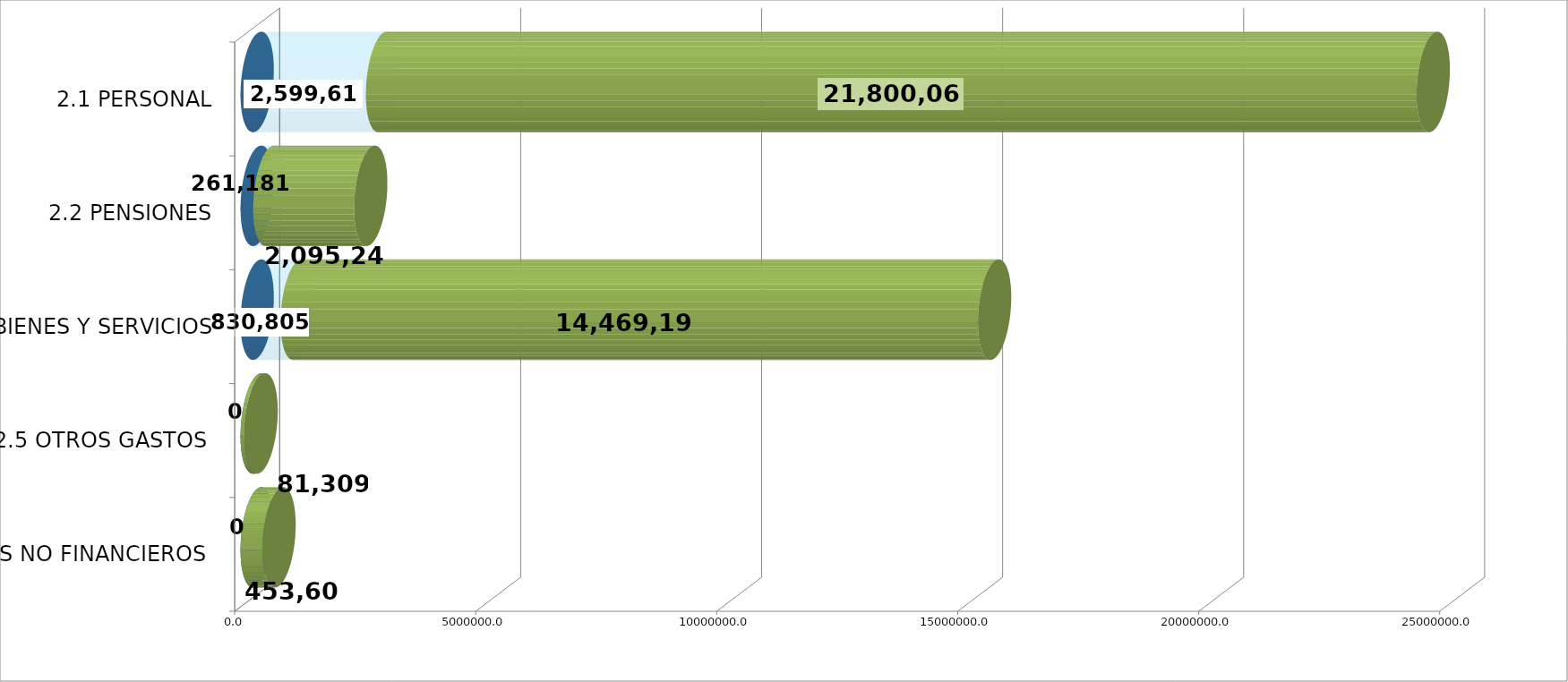
| Category | GENERICA | EJECUTADO | SALDO  |
|---|---|---|---|
| 2.1 PERSONAL | 0 | 2599616.3 | 21800065.7 |
| 2.2 PENSIONES | 0 | 261180.72 | 2095241.28 |
| 2.3 BIENES Y SERVICIOS | 0 | 830805.27 | 14469194.73 |
| 2.5 OTROS GASTOS  | 0 | 0 | 81309 |
| 2.6 ACTIVOS NO FINANCIEROS  | 0 | 0 | 453602 |